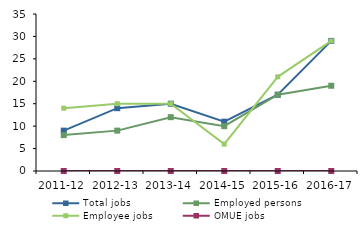
| Category | Total jobs | Employed persons | Employee jobs | OMUE jobs |
|---|---|---|---|---|
| 2011-12 | 9 | 8 | 14 | 0 |
| 2012-13 | 14 | 9 | 15 | 0 |
| 2013-14 | 15 | 12 | 15 | 0 |
| 2014-15 | 11 | 10 | 6 | 0 |
| 2015-16 | 17 | 17 | 21 | 0 |
| 2016-17 | 29 | 19 | 29 | 0 |